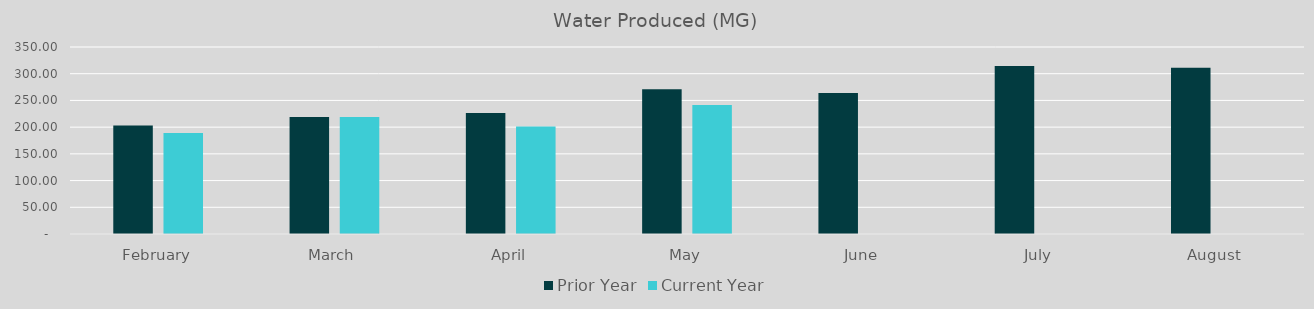
| Category | Prior Year | Current Year |
|---|---|---|
| February | 202.92 | 189.14 |
| March | 218.89 | 218.9 |
| April | 226.62 | 201.4 |
| May | 270.85 | 241.3 |
| June | 263.67 | 0 |
| July | 314.55 | 0 |
| August | 311.17 | 0 |